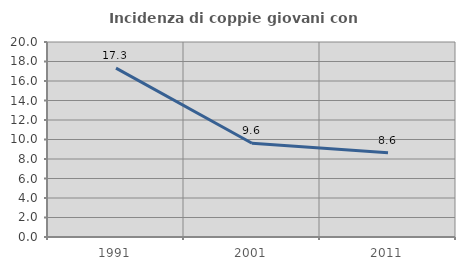
| Category | Incidenza di coppie giovani con figli |
|---|---|
| 1991.0 | 17.326 |
| 2001.0 | 9.615 |
| 2011.0 | 8.642 |